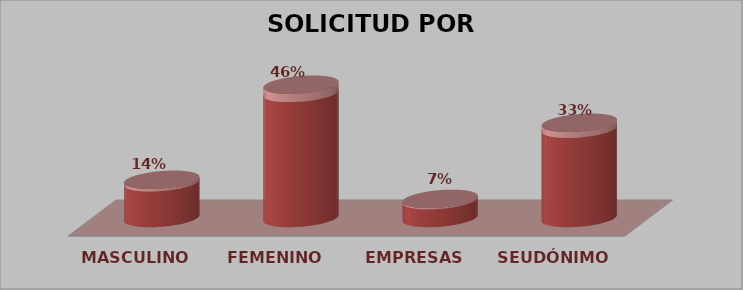
| Category | SOLICITUD POR GÉNERO | Series 1 |
|---|---|---|
| MASCULINO | 2 | 0.14 |
| FEMENINO | 7 | 0.46 |
| EMPRESAS | 1 | 0.07 |
| SEUDÓNIMO | 5 | 0.33 |